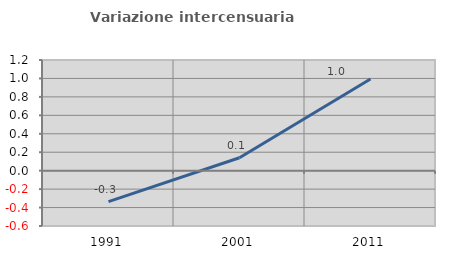
| Category | Variazione intercensuaria annua |
|---|---|
| 1991.0 | -0.335 |
| 2001.0 | 0.14 |
| 2011.0 | 0.995 |